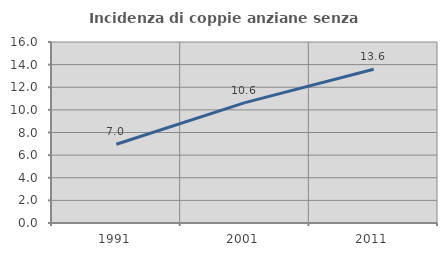
| Category | Incidenza di coppie anziane senza figli  |
|---|---|
| 1991.0 | 6.961 |
| 2001.0 | 10.642 |
| 2011.0 | 13.586 |